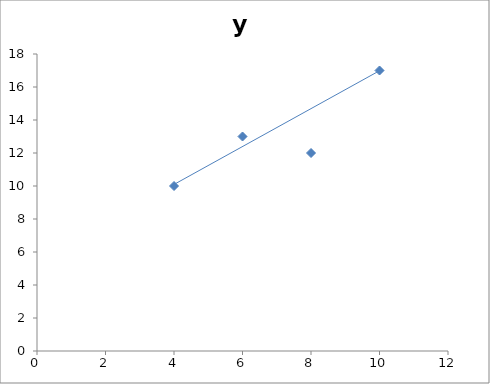
| Category | y |
|---|---|
| 4.0 | 10 |
| 6.0 | 13 |
| 8.0 | 12 |
| 10.0 | 17 |